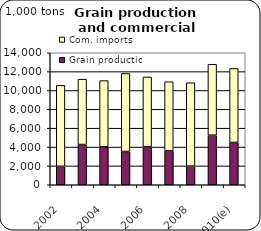
| Category | Grain production | Com. imports |
|---|---|---|
| 2002 | 1953.125 | 8590.177 |
| 2003 | 4266.166 | 6930.911 |
| 2004 | 4033.028 | 7013.855 |
| 2005 | 3527.634 | 8273.392 |
| 2006 | 4017.945 | 7414.584 |
| 2007 | 3589.87 | 7337.583 |
| 2008 | 1974.7 | 8843.645 |
| 2009 | 5252.7 | 7529.591 |
| 2010(e) | 4486.7 | 7848.908 |